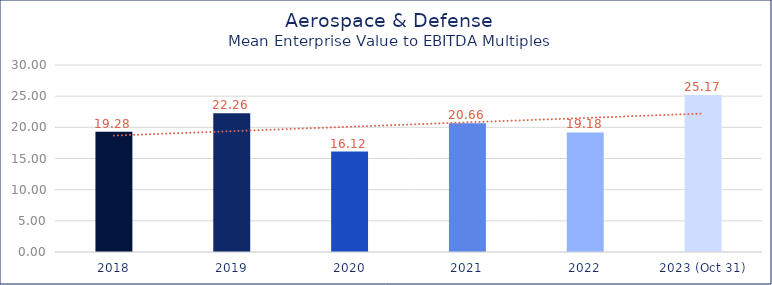
| Category | Aerospace & Defense |
|---|---|
| 2018 | 19.28 |
| 2019 | 22.26 |
| 2020 | 16.12 |
| 2021 | 20.66 |
| 2022 | 19.18 |
| 2023 (Oct 31) | 25.17 |